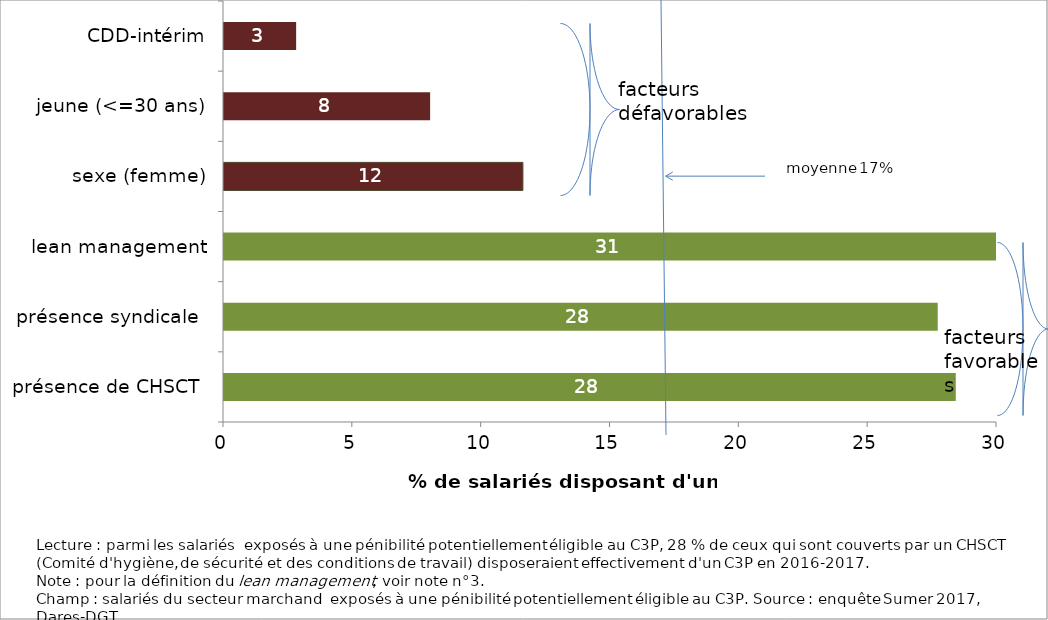
| Category | Series 0 |
|---|---|
| présence de CHSCT  | 28.4 |
| présence syndicale  | 27.7 |
| lean management | 31.3 |
| sexe (femme) | 11.6 |
| jeune (<=30 ans) | 8 |
| CDD-intérim | 2.8 |